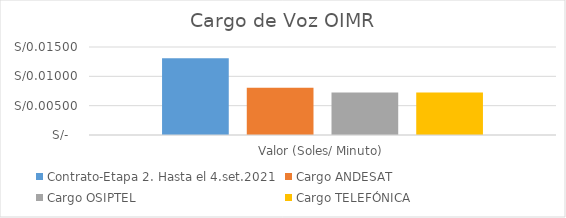
| Category | Contrato-Etapa 2. Hasta el 4.set.2021 | Cargo ANDESAT | Cargo OSIPTEL | Cargo TELEFÓNICA |
|---|---|---|---|---|
| Valor (Soles/ Minuto) | 0.013 | 0.008 | 0.007 | 0.007 |